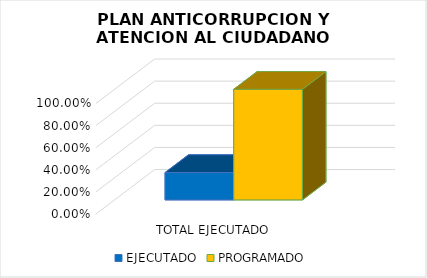
| Category | EJECUTADO | PROGRAMADO |
|---|---|---|
| TOTAL EJECUTADO  | 0.248 | 1 |